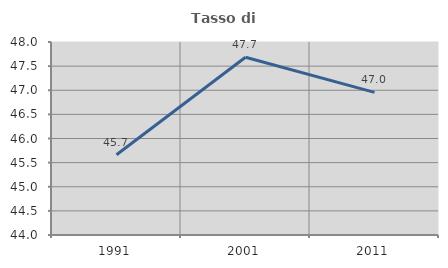
| Category | Tasso di occupazione   |
|---|---|
| 1991.0 | 45.662 |
| 2001.0 | 47.685 |
| 2011.0 | 46.957 |